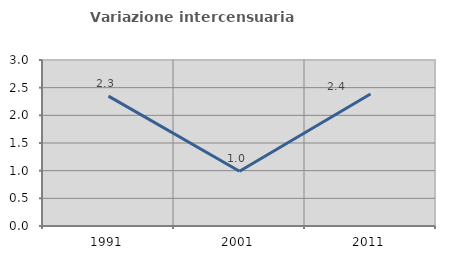
| Category | Variazione intercensuaria annua |
|---|---|
| 1991.0 | 2.348 |
| 2001.0 | 0.99 |
| 2011.0 | 2.386 |